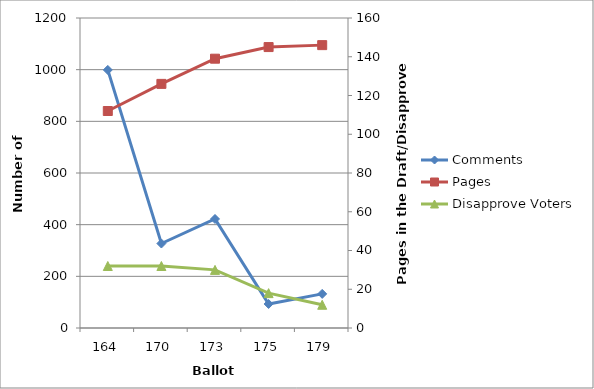
| Category | Comments |
|---|---|
| 164.0 | 999 |
| 170.0 | 327 |
| 173.0 | 422 |
| 175.0 | 93 |
| 179.0 | 132 |